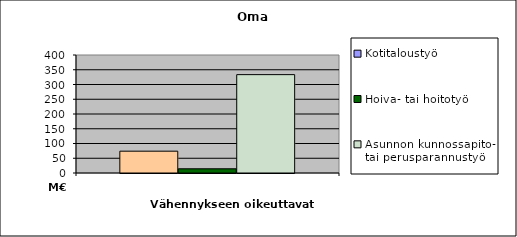
| Category | Kotitaloustyö | Hoiva- tai hoitotyö | Asunnon kunnossapito- tai perusparannustyö |
|---|---|---|---|
| 0 | 73952274.72 | 14277607.24 | 333445086.1 |